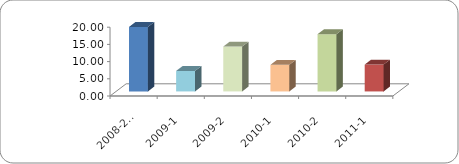
| Category | ALUMNO BECADO |
|---|---|
| 2008-2009 | 18.754 |
| 2009-1 | 5.96 |
| 2009-2 | 13.05 |
| 2010-1 | 7.732 |
| 2010-2 | 16.65 |
| 2011-1 | 7.821 |